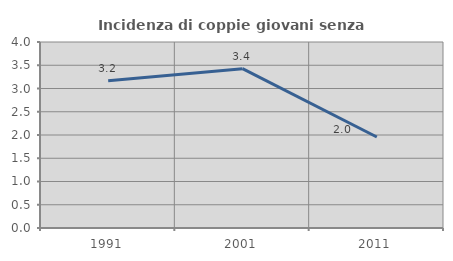
| Category | Incidenza di coppie giovani senza figli |
|---|---|
| 1991.0 | 3.166 |
| 2001.0 | 3.427 |
| 2011.0 | 1.957 |